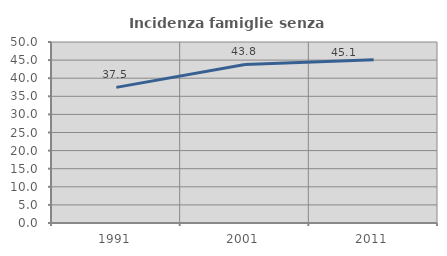
| Category | Incidenza famiglie senza nuclei |
|---|---|
| 1991.0 | 37.471 |
| 2001.0 | 43.81 |
| 2011.0 | 45.095 |